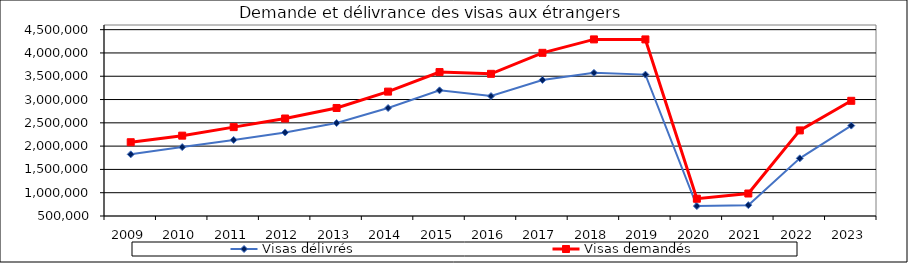
| Category | Visas délivrés | Visas demandés |
|---|---|---|
| 2009.0 | 1823631 | 2083733 |
| 2010.0 | 1979513 | 2224845 |
| 2011.0 | 2132968 | 2407705 |
| 2012.0 | 2293084 | 2592887 |
| 2013.0 | 2495598 | 2818848 |
| 2014.0 | 2817670 | 3169841 |
| 2015.0 | 3197505 | 3589610 |
| 2016.0 | 3074601 | 3551864 |
| 2017.0 | 3420396 | 4002677 |
| 2018.0 | 3572326 | 4291040 |
| 2019.0 | 3534999 | 4290482 |
| 2020.0 | 712317 | 870798 |
| 2021.0 | 733070 | 982896 |
| 2022.0 | 1738138 | 2337173 |
| 2023.0 | 2440125 | 2972932 |